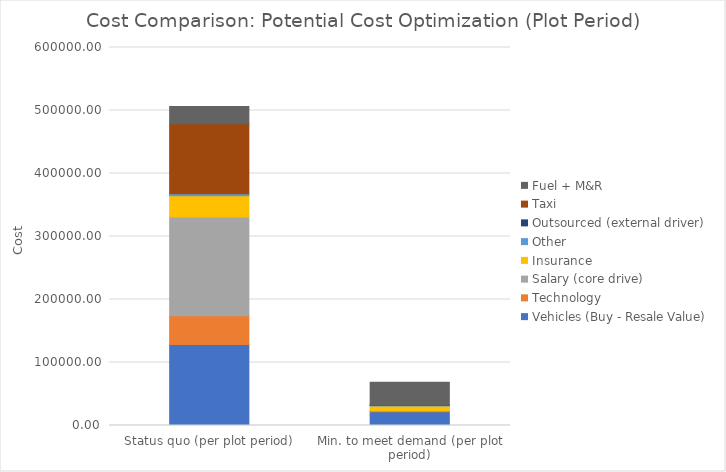
| Category | Vehicles (Buy - Resale Value) | Technology | Salary (core drive) | Insurance | Other | Outsourced (external driver) | Taxi  | Fuel + M&R |
|---|---|---|---|---|---|---|---|---|
| Status quo (per plot period) | 128693.333 | 45491.367 | 156950 | 33586.775 | 3316.925 | 0 | 111081.475 | 27379.925 |
| Min. to meet demand (per plot period) | 21979.833 | 1493.133 | 0 | 7480 | 694.98 | 0 | 1147.5 | 35940 |